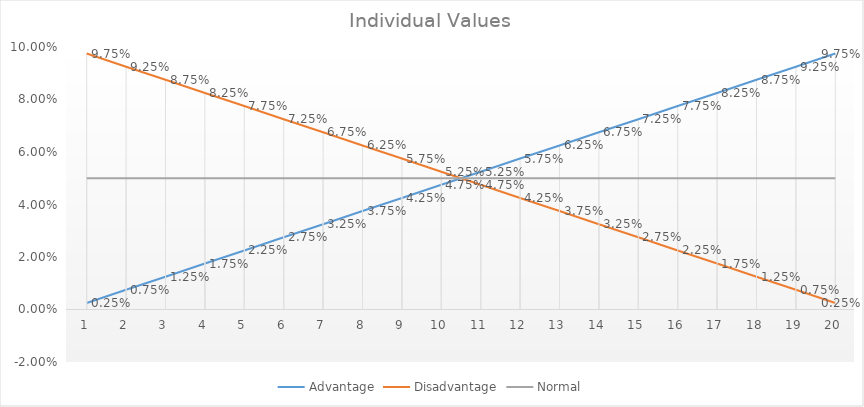
| Category | Advantage | Disadvantage | Normal |
|---|---|---|---|
| 1.0 | 0.002 | 0.098 | 0.05 |
| 2.0 | 0.008 | 0.092 | 0.05 |
| 3.0 | 0.012 | 0.088 | 0.05 |
| 4.0 | 0.018 | 0.082 | 0.05 |
| 5.0 | 0.022 | 0.078 | 0.05 |
| 6.0 | 0.028 | 0.072 | 0.05 |
| 7.0 | 0.032 | 0.068 | 0.05 |
| 8.0 | 0.038 | 0.062 | 0.05 |
| 9.0 | 0.042 | 0.058 | 0.05 |
| 10.0 | 0.048 | 0.052 | 0.05 |
| 11.0 | 0.052 | 0.048 | 0.05 |
| 12.0 | 0.058 | 0.042 | 0.05 |
| 13.0 | 0.062 | 0.038 | 0.05 |
| 14.0 | 0.068 | 0.032 | 0.05 |
| 15.0 | 0.072 | 0.028 | 0.05 |
| 16.0 | 0.078 | 0.022 | 0.05 |
| 17.0 | 0.082 | 0.018 | 0.05 |
| 18.0 | 0.088 | 0.012 | 0.05 |
| 19.0 | 0.092 | 0.008 | 0.05 |
| 20.0 | 0.098 | 0.002 | 0.05 |